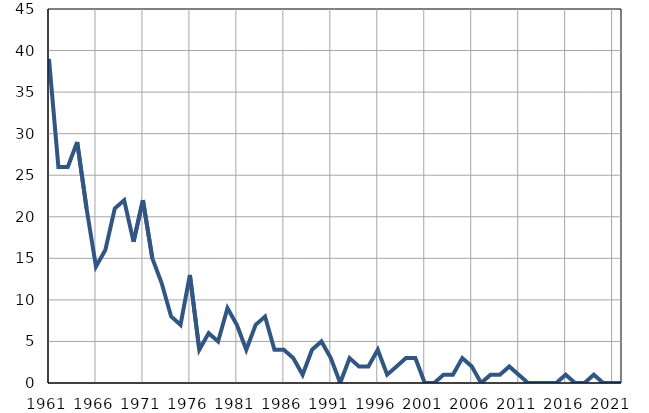
| Category | Умрла 
одојчад |
|---|---|
| 1961.0 | 39 |
| 1962.0 | 26 |
| 1963.0 | 26 |
| 1964.0 | 29 |
| 1965.0 | 21 |
| 1966.0 | 14 |
| 1967.0 | 16 |
| 1968.0 | 21 |
| 1969.0 | 22 |
| 1970.0 | 17 |
| 1971.0 | 22 |
| 1972.0 | 15 |
| 1973.0 | 12 |
| 1974.0 | 8 |
| 1975.0 | 7 |
| 1976.0 | 13 |
| 1977.0 | 4 |
| 1978.0 | 6 |
| 1979.0 | 5 |
| 1980.0 | 9 |
| 1981.0 | 7 |
| 1982.0 | 4 |
| 1983.0 | 7 |
| 1984.0 | 8 |
| 1985.0 | 4 |
| 1986.0 | 4 |
| 1987.0 | 3 |
| 1988.0 | 1 |
| 1989.0 | 4 |
| 1990.0 | 5 |
| 1991.0 | 3 |
| 1992.0 | 0 |
| 1993.0 | 3 |
| 1994.0 | 2 |
| 1995.0 | 2 |
| 1996.0 | 4 |
| 1997.0 | 1 |
| 1998.0 | 2 |
| 1999.0 | 3 |
| 2000.0 | 3 |
| 2001.0 | 0 |
| 2002.0 | 0 |
| 2003.0 | 1 |
| 2004.0 | 1 |
| 2005.0 | 3 |
| 2006.0 | 2 |
| 2007.0 | 0 |
| 2008.0 | 1 |
| 2009.0 | 1 |
| 2010.0 | 2 |
| 2011.0 | 1 |
| 2012.0 | 0 |
| 2013.0 | 0 |
| 2014.0 | 0 |
| 2015.0 | 0 |
| 2016.0 | 1 |
| 2017.0 | 0 |
| 2018.0 | 0 |
| 2019.0 | 1 |
| 2020.0 | 0 |
| 2021.0 | 0 |
| 2022.0 | 0 |